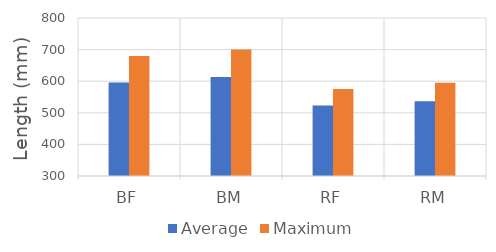
| Category | Average | Maximum |
|---|---|---|
| BF | 595.864 | 680 |
| BM | 613.676 | 700 |
| RF | 522.806 | 575 |
| RM | 536.471 | 595 |